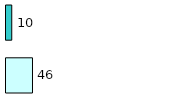
| Category | Series 0 | Series 1 |
|---|---|---|
| 0 | 46 | 10 |